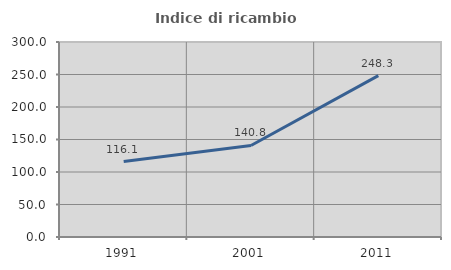
| Category | Indice di ricambio occupazionale  |
|---|---|
| 1991.0 | 116.098 |
| 2001.0 | 140.782 |
| 2011.0 | 248.322 |